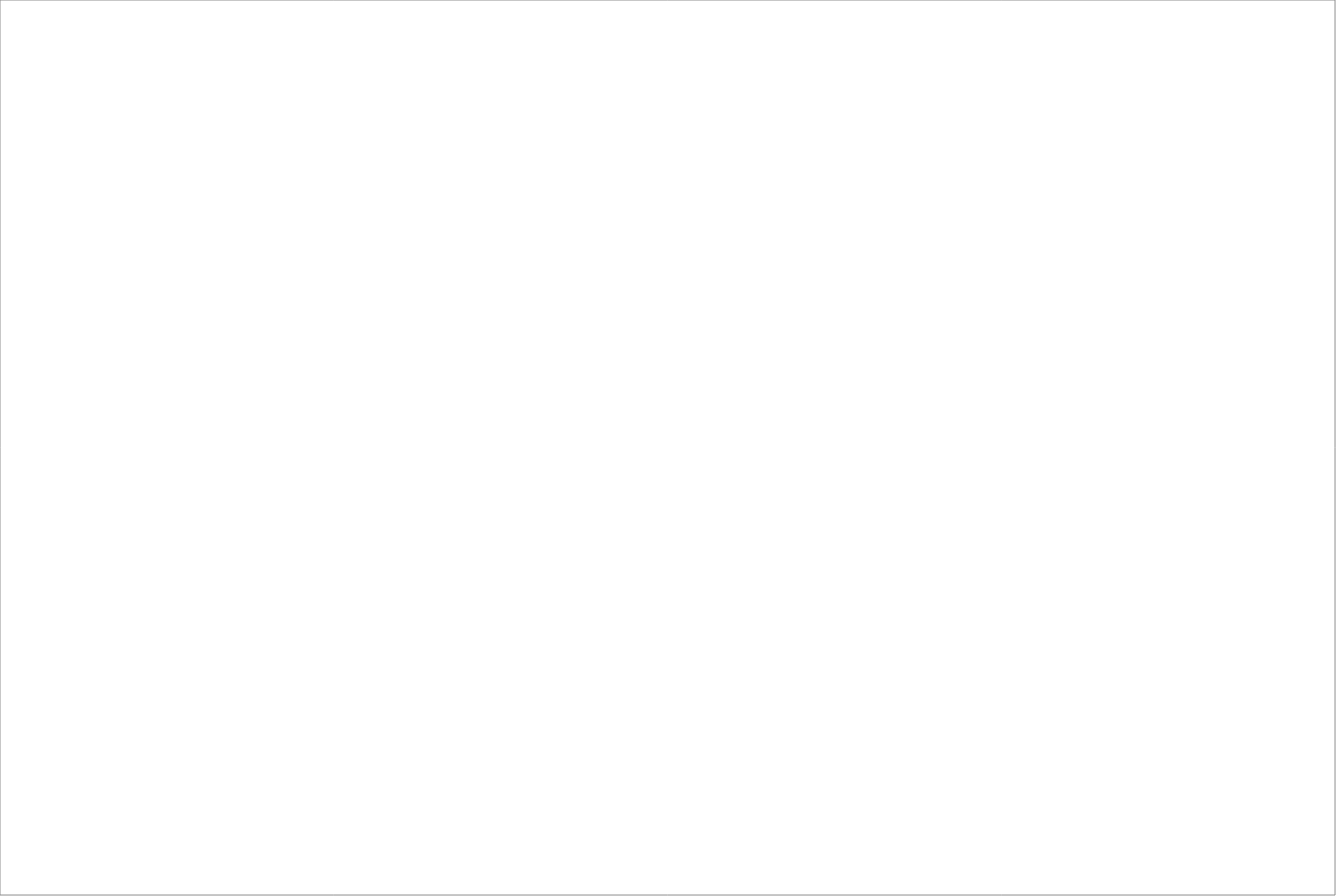
| Category | Total |
|---|---|
| Randstad AB | 76.415 |
| Poolia Sverige Aktiebolag | 65 |
| StudentConsulting Sweden AB | 65 |
| Experis AB | 62.5 |
| Academic Work Sweden AB | 62.5 |